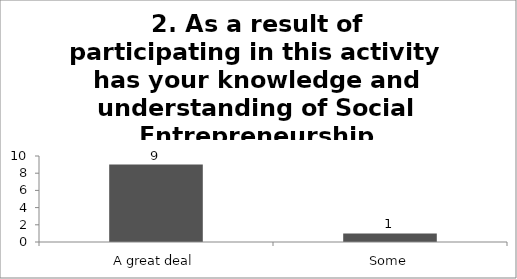
| Category | 2. As a result of participating in this activity has your knowledge and understanding of Social Entrepreneurship developed? |
|---|---|
| A great deal | 9 |
| Some | 1 |